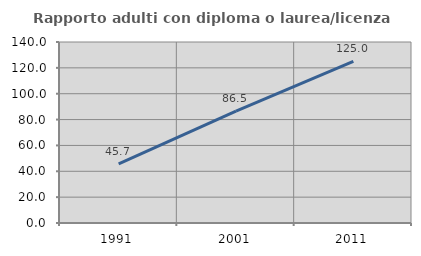
| Category | Rapporto adulti con diploma o laurea/licenza media  |
|---|---|
| 1991.0 | 45.667 |
| 2001.0 | 86.491 |
| 2011.0 | 124.981 |